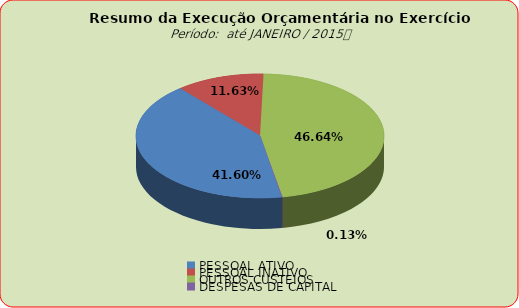
| Category | Series 0 |
|---|---|
| PESSOAL ATIVO | 12879900.87 |
| PESSOAL INATIVO | 3600745.86 |
| OUTROS CUSTEIOS | 14439344.25 |
| DESPESAS DE CAPITAL | 40000 |